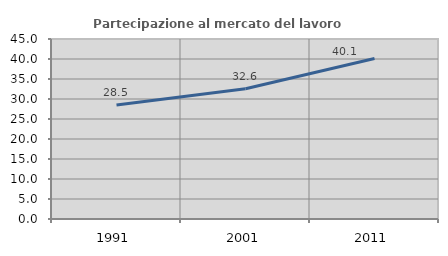
| Category | Partecipazione al mercato del lavoro  femminile |
|---|---|
| 1991.0 | 28.511 |
| 2001.0 | 32.556 |
| 2011.0 | 40.118 |